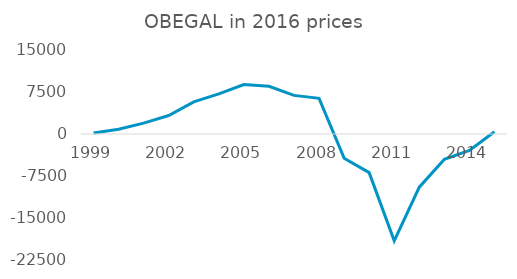
| Category | OBEGAL |
|---|---|
| 1999-06-01 | 184.627 |
| 2000-06-01 | 839.392 |
| 2001-06-01 | 1947.213 |
| 2002-06-01 | 3294.345 |
| 2003-06-01 | 5735.317 |
| 2004-06-01 | 7151.837 |
| 2005-06-01 | 8826.59 |
| 2006-06-01 | 8509.2 |
| 2007-06-01 | 6894.118 |
| 2008-06-01 | 6375.495 |
| 2009-06-01 | -4321.554 |
| 2010-06-01 | -6895.359 |
| 2011-06-01 | -19079.689 |
| 2012-06-01 | -9493.151 |
| 2013-06-01 | -4504.082 |
| 2014-06-01 | -2945.272 |
| 2015-06-01 | 414 |